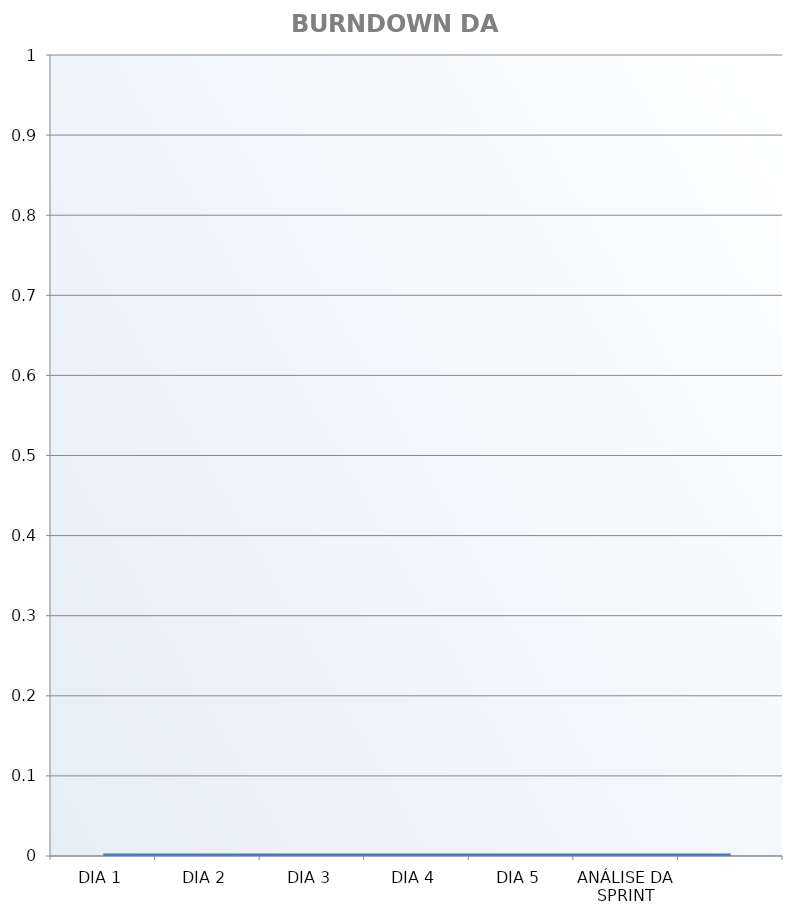
| Category | Gráfico de burndown da sprint |
|---|---|
| DIA 1 | 0 |
| DIA 2 | 0 |
| DIA 3 | 0 |
| DIA 4 | 0 |
| DIA 5 | 0 |
| ANÁLISE DA SPRINT | 0 |